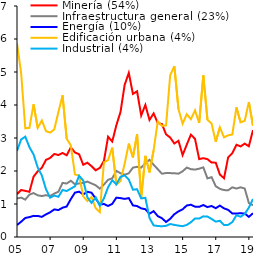
| Category | Minería (54%) | Infraestructura general (23%) | Energía (10%) | Edificación urbana (4%) | Industrial (4%) |
|---|---|---|---|---|---|
| 2005-03-01 | 1.298 | 1.168 | 0.363 | 5.864 | 2.61 |
| 2005-06-01 | 1.424 | 1.193 | 0.463 | 4.968 | 2.955 |
| 2005-09-01 | 1.398 | 1.133 | 0.577 | 3.294 | 3.041 |
| 2005-12-01 | 1.369 | 1.283 | 0.602 | 3.31 | 2.721 |
| 2006-03-01 | 1.828 | 1.331 | 0.64 | 4.021 | 2.502 |
| 2006-06-01 | 1.989 | 1.263 | 0.638 | 3.307 | 2.108 |
| 2006-09-01 | 2.099 | 1.241 | 0.61 | 3.532 | 1.864 |
| 2006-12-01 | 2.337 | 1.267 | 0.686 | 3.207 | 1.447 |
| 2007-03-01 | 2.395 | 1.242 | 0.749 | 3.164 | 1.192 |
| 2007-06-01 | 2.517 | 1.315 | 0.836 | 3.26 | 1.256 |
| 2007-09-01 | 2.483 | 1.371 | 0.816 | 3.786 | 1.219 |
| 2007-12-01 | 2.546 | 1.639 | 0.887 | 4.292 | 1.424 |
| 2008-03-01 | 2.476 | 1.62 | 0.924 | 2.977 | 1.393 |
| 2008-06-01 | 2.716 | 1.704 | 1.149 | 2.777 | 1.466 |
| 2008-09-01 | 2.561 | 1.598 | 1.345 | 1.892 | 1.536 |
| 2008-12-01 | 2.508 | 1.623 | 1.373 | 1.864 | 1.855 |
| 2009-03-01 | 2.188 | 1.639 | 1.293 | 1.234 | 1.708 |
| 2009-06-01 | 2.251 | 1.679 | 1.369 | 1.088 | 1.201 |
| 2009-09-01 | 2.146 | 1.623 | 1.343 | 1.21 | 1.034 |
| 2009-12-01 | 2.021 | 1.567 | 1.163 | 0.875 | 1.203 |
| 2010-03-01 | 2.093 | 1.465 | 0.985 | 0.757 | 0.945 |
| 2010-06-01 | 2.306 | 1.589 | 0.999 | 2.264 | 1.173 |
| 2010-09-01 | 3.039 | 1.733 | 0.94 | 2.331 | 1.51 |
| 2010-12-01 | 2.892 | 1.778 | 1.002 | 2.708 | 1.717 |
| 2011-03-01 | 3.388 | 2.004 | 1.192 | 1.589 | 1.597 |
| 2011-06-01 | 3.788 | 1.932 | 1.178 | 1.696 | 1.824 |
| 2011-09-01 | 4.609 | 1.886 | 1.155 | 2.219 | 1.868 |
| 2011-12-01 | 4.973 | 1.931 | 1.179 | 2.829 | 1.742 |
| 2012-03-01 | 4.336 | 2.101 | 0.957 | 2.411 | 1.434 |
| 2012-06-01 | 4.416 | 2.127 | 0.937 | 3.112 | 1.447 |
| 2012-09-01 | 3.683 | 2.102 | 0.868 | 1.19 | 1.169 |
| 2012-12-01 | 4.003 | 2.236 | 0.841 | 2.46 | 1.188 |
| 2013-03-01 | 3.547 | 2.339 | 0.704 | 1.957 | 0.578 |
| 2013-06-01 | 3.746 | 2.188 | 0.783 | 2.631 | 0.352 |
| 2013-09-01 | 3.452 | 2.055 | 0.632 | 3.506 | 0.333 |
| 2013-12-01 | 3.423 | 1.917 | 0.57 | 3.369 | 0.326 |
| 2014-03-01 | 3.111 | 1.938 | 0.456 | 3.383 | 0.337 |
| 2014-06-01 | 3.013 | 1.936 | 0.551 | 4.901 | 0.393 |
| 2014-09-01 | 2.833 | 1.932 | 0.691 | 5.18 | 0.367 |
| 2014-12-01 | 2.916 | 1.919 | 0.775 | 3.875 | 0.345 |
| 2015-03-01 | 2.482 | 1.991 | 0.838 | 3.434 | 0.328 |
| 2015-06-01 | 2.799 | 2.104 | 0.955 | 3.721 | 0.366 |
| 2015-09-01 | 3.101 | 2.056 | 0.977 | 3.57 | 0.449 |
| 2015-12-01 | 2.973 | 2.042 | 0.919 | 3.837 | 0.561 |
| 2016-03-01 | 2.361 | 2.07 | 0.913 | 3.457 | 0.56 |
| 2016-06-01 | 2.388 | 2.11 | 0.97 | 4.899 | 0.626 |
| 2016-09-01 | 2.36 | 1.775 | 0.907 | 3.549 | 0.62 |
| 2016-12-01 | 2.254 | 1.813 | 0.94 | 3.442 | 0.546 |
| 2017-03-01 | 2.254 | 1.54 | 0.873 | 2.886 | 0.466 |
| 2017-06-01 | 1.893 | 1.46 | 0.952 | 3.323 | 0.492 |
| 2017-09-01 | 1.78 | 1.421 | 0.868 | 3.02 | 0.364 |
| 2017-12-01 | 2.415 | 1.416 | 0.822 | 3.082 | 0.368 |
| 2018-03-01 | 2.54 | 1.505 | 0.713 | 3.106 | 0.45 |
| 2018-06-01 | 2.795 | 1.468 | 0.713 | 3.927 | 0.661 |
| 2018-09-01 | 2.746 | 1.506 | 0.719 | 3.475 | 0.613 |
| 2018-12-01 | 2.828 | 1.469 | 0.712 | 3.521 | 0.699 |
| 2019-03-01 | 2.75 | 1.03 | 0.61 | 4.09 | 0.89 |
| 2019-06-01 | 3.24 | 0.96 | 0.72 | 3.37 | 1.15 |